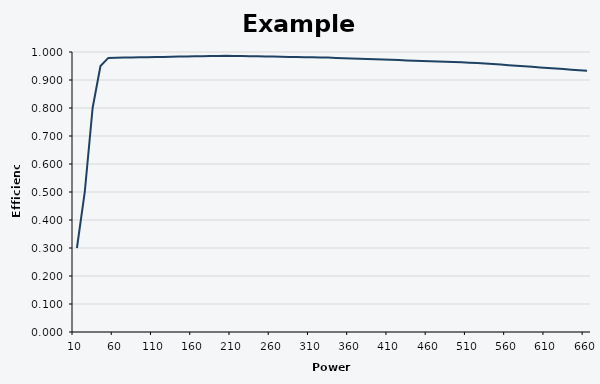
| Category | Series 0 |
|---|---|
| 10.0 | 0.3 |
| 20.0 | 0.5 |
| 30.0 | 0.8 |
| 40.0 | 0.95 |
| 50.0 | 0.979 |
| 60.0 | 0.98 |
| 70.0 | 0.98 |
| 80.0 | 0.98 |
| 90.0 | 0.981 |
| 100.0 | 0.981 |
| 110.0 | 0.982 |
| 120.0 | 0.982 |
| 130.0 | 0.983 |
| 140.0 | 0.983 |
| 150.0 | 0.984 |
| 160.0 | 0.984 |
| 170.0 | 0.985 |
| 180.0 | 0.985 |
| 190.0 | 0.986 |
| 200.0 | 0.986 |
| 210.0 | 0.986 |
| 220.0 | 0.985 |
| 230.0 | 0.985 |
| 240.0 | 0.984 |
| 250.0 | 0.984 |
| 260.0 | 0.983 |
| 270.0 | 0.983 |
| 280.0 | 0.982 |
| 290.0 | 0.982 |
| 300.0 | 0.981 |
| 310.0 | 0.981 |
| 320.0 | 0.98 |
| 330.0 | 0.98 |
| 340.0 | 0.979 |
| 350.0 | 0.978 |
| 360.0 | 0.977 |
| 370.0 | 0.976 |
| 380.0 | 0.975 |
| 390.0 | 0.974 |
| 400.0 | 0.973 |
| 410.0 | 0.972 |
| 420.0 | 0.971 |
| 430.0 | 0.97 |
| 440.0 | 0.969 |
| 450.0 | 0.968 |
| 460.0 | 0.967 |
| 470.0 | 0.966 |
| 480.0 | 0.965 |
| 490.0 | 0.964 |
| 500.0 | 0.963 |
| 510.0 | 0.962 |
| 520.0 | 0.961 |
| 530.0 | 0.959 |
| 540.0 | 0.957 |
| 550.0 | 0.955 |
| 560.0 | 0.953 |
| 570.0 | 0.951 |
| 580.0 | 0.949 |
| 590.0 | 0.947 |
| 600.0 | 0.945 |
| 610.0 | 0.943 |
| 620.0 | 0.941 |
| 630.0 | 0.939 |
| 640.0 | 0.937 |
| 650.0 | 0.935 |
| 660.0 | 0.933 |